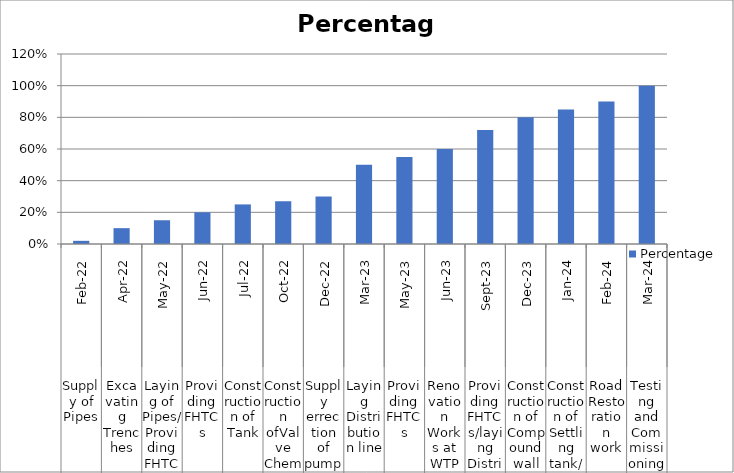
| Category | Percentage |
|---|---|
| 0 | 0.02 |
| 1 | 0.1 |
| 2 | 0.15 |
| 3 | 0.2 |
| 4 | 0.25 |
| 5 | 0.27 |
| 6 | 0.3 |
| 7 | 0.5 |
| 8 | 0.55 |
| 9 | 0.6 |
| 10 | 0.72 |
| 11 | 0.8 |
| 12 | 0.85 |
| 13 | 0.9 |
| 14 | 1 |